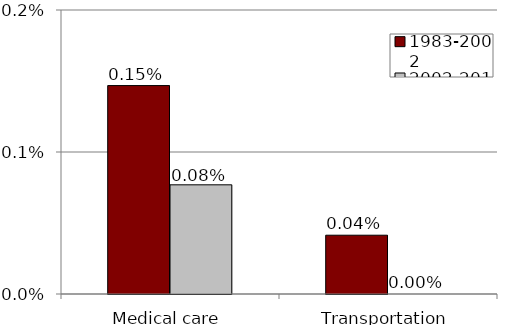
| Category | 1983-2002 | 2002-2015 |
|---|---|---|
| Medical care | 0.001 | 0.001 |
| Transportation | 0 | 0 |